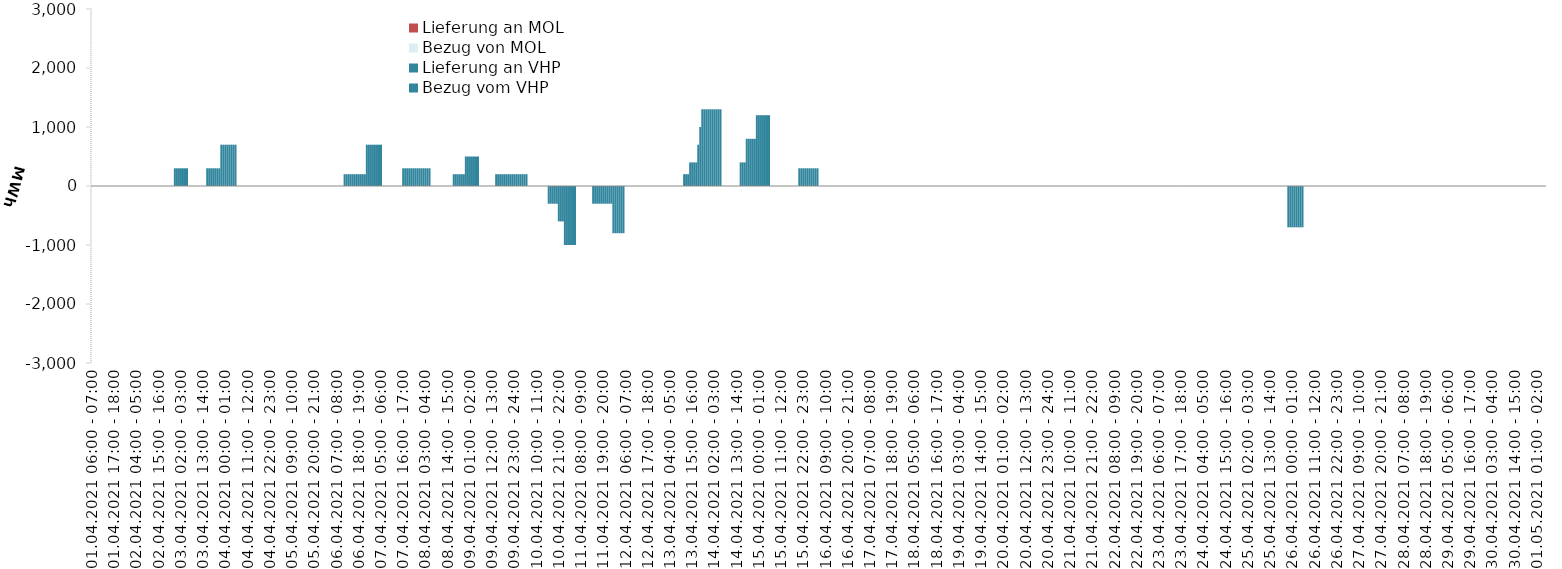
| Category | Bezug vom VHP | Lieferung an VHP | Bezug von MOL | Lieferung an MOL |
|---|---|---|---|---|
| 01.04.2021 06:00 - 07:00 | 0 | 0 | 0 | 0 |
| 01.04.2021 07:00 - 08:00 | 0 | 0 | 0 | 0 |
| 01.04.2021 08:00 - 09:00 | 0 | 0 | 0 | 0 |
| 01.04.2021 09:00 - 10:00 | 0 | 0 | 0 | 0 |
| 01.04.2021 10:00 - 11:00 | 0 | 0 | 0 | 0 |
| 01.04.2021 11:00 - 12:00 | 0 | 0 | 0 | 0 |
| 01.04.2021 12:00 - 13:00 | 0 | 0 | 0 | 0 |
| 01.04.2021 13:00 - 14:00 | 0 | 0 | 0 | 0 |
| 01.04.2021 14:00 - 15:00 | 0 | 0 | 0 | 0 |
| 01.04.2021 15:00 - 16:00 | 0 | 0 | 0 | 0 |
| 01.04.2021 16:00 - 17:00 | 0 | 0 | 0 | 0 |
| 01.04.2021 17:00 - 18:00 | 0 | 0 | 0 | 0 |
| 01.04.2021 18:00 - 19:00 | 0 | 0 | 0 | 0 |
| 01.04.2021 19:00 - 20:00 | 0 | 0 | 0 | 0 |
| 01.04.2021 20:00 - 21:00 | 0 | 0 | 0 | 0 |
| 01.04.2021 21:00 - 22:00 | 0 | 0 | 0 | 0 |
| 01.04.2021 22:00 - 23:00 | 0 | 0 | 0 | 0 |
| 01.04.2021 23:00 - 24:00 | 0 | 0 | 0 | 0 |
| 02.04.2021 00:00 - 01:00 | 0 | 0 | 0 | 0 |
| 02.04.2021 01:00 - 02:00 | 0 | 0 | 0 | 0 |
| 02.04.2021 02:00 - 03:00 | 0 | 0 | 0 | 0 |
| 02.04.2021 03:00 - 04:00 | 0 | 0 | 0 | 0 |
| 02.04.2021 04:00 - 05:00 | 0 | 0 | 0 | 0 |
| 02.04.2021 05:00 - 06:00 | 0 | 0 | 0 | 0 |
| 02.04.2021 06:00 - 07:00 | 0 | 0 | 0 | 0 |
| 02.04.2021 07:00 - 08:00 | 0 | 0 | 0 | 0 |
| 02.04.2021 08:00 - 09:00 | 0 | 0 | 0 | 0 |
| 02.04.2021 09:00 - 10:00 | 0 | 0 | 0 | 0 |
| 02.04.2021 10:00 - 11:00 | 0 | 0 | 0 | 0 |
| 02.04.2021 11:00 - 12:00 | 0 | 0 | 0 | 0 |
| 02.04.2021 12:00 - 13:00 | 0 | 0 | 0 | 0 |
| 02.04.2021 13:00 - 14:00 | 0 | 0 | 0 | 0 |
| 02.04.2021 14:00 - 15:00 | 0 | 0 | 0 | 0 |
| 02.04.2021 15:00 - 16:00 | 0 | 0 | 0 | 0 |
| 02.04.2021 16:00 - 17:00 | 0 | 0 | 0 | 0 |
| 02.04.2021 17:00 - 18:00 | 0 | 0 | 0 | 0 |
| 02.04.2021 18:00 - 19:00 | 0 | 0 | 0 | 0 |
| 02.04.2021 19:00 - 20:00 | 0 | 0 | 0 | 0 |
| 02.04.2021 20:00 - 21:00 | 0 | 0 | 0 | 0 |
| 02.04.2021 21:00 - 22:00 | 0 | 0 | 0 | 0 |
| 02.04.2021 22:00 - 23:00 | 0 | 0 | 0 | 0 |
| 02.04.2021 23:00 - 24:00 | 300 | 0 | 0 | 0 |
| 03.04.2021 00:00 - 01:00 | 300 | 0 | 0 | 0 |
| 03.04.2021 01:00 - 02:00 | 300 | 0 | 0 | 0 |
| 03.04.2021 02:00 - 03:00 | 300 | 0 | 0 | 0 |
| 03.04.2021 03:00 - 04:00 | 300 | 0 | 0 | 0 |
| 03.04.2021 04:00 - 05:00 | 300 | 0 | 0 | 0 |
| 03.04.2021 05:00 - 06:00 | 300 | 0 | 0 | 0 |
| 03.04.2021 06:00 - 07:00 | 0 | 0 | 0 | 0 |
| 03.04.2021 07:00 - 08:00 | 0 | 0 | 0 | 0 |
| 03.04.2021 08:00 - 09:00 | 0 | 0 | 0 | 0 |
| 03.04.2021 09:00 - 10:00 | 0 | 0 | 0 | 0 |
| 03.04.2021 10:00 - 11:00 | 0 | 0 | 0 | 0 |
| 03.04.2021 11:00 - 12:00 | 0 | 0 | 0 | 0 |
| 03.04.2021 12:00 - 13:00 | 0 | 0 | 0 | 0 |
| 03.04.2021 13:00 - 14:00 | 0 | 0 | 0 | 0 |
| 03.04.2021 14:00 - 15:00 | 0 | 0 | 0 | 0 |
| 03.04.2021 15:00 - 16:00 | 300 | 0 | 0 | 0 |
| 03.04.2021 16:00 - 17:00 | 300 | 0 | 0 | 0 |
| 03.04.2021 17:00 - 18:00 | 300 | 0 | 0 | 0 |
| 03.04.2021 18:00 - 19:00 | 300 | 0 | 0 | 0 |
| 03.04.2021 19:00 - 20:00 | 300 | 0 | 0 | 0 |
| 03.04.2021 20:00 - 21:00 | 300 | 0 | 0 | 0 |
| 03.04.2021 21:00 - 22:00 | 300 | 0 | 0 | 0 |
| 03.04.2021 22:00 - 23:00 | 700 | 0 | 0 | 0 |
| 03.04.2021 23:00 - 24:00 | 700 | 0 | 0 | 0 |
| 04.04.2021 00:00 - 01:00 | 700 | 0 | 0 | 0 |
| 04.04.2021 01:00 - 02:00 | 700 | 0 | 0 | 0 |
| 04.04.2021 02:00 - 03:00 | 700 | 0 | 0 | 0 |
| 04.04.2021 03:00 - 04:00 | 700 | 0 | 0 | 0 |
| 04.04.2021 04:00 - 05:00 | 700 | 0 | 0 | 0 |
| 04.04.2021 05:00 - 06:00 | 700 | 0 | 0 | 0 |
| 04.04.2021 06:00 - 07:00 | 0 | 0 | 0 | 0 |
| 04.04.2021 07:00 - 08:00 | 0 | 0 | 0 | 0 |
| 04.04.2021 08:00 - 09:00 | 0 | 0 | 0 | 0 |
| 04.04.2021 09:00 - 10:00 | 0 | 0 | 0 | 0 |
| 04.04.2021 10:00 - 11:00 | 0 | 0 | 0 | 0 |
| 04.04.2021 11:00 - 12:00 | 0 | 0 | 0 | 0 |
| 04.04.2021 12:00 - 13:00 | 0 | 0 | 0 | 0 |
| 04.04.2021 13:00 - 14:00 | 0 | 0 | 0 | 0 |
| 04.04.2021 14:00 - 15:00 | 0 | 0 | 0 | 0 |
| 04.04.2021 15:00 - 16:00 | 0 | 0 | 0 | 0 |
| 04.04.2021 16:00 - 17:00 | 0 | 0 | 0 | 0 |
| 04.04.2021 17:00 - 18:00 | 0 | 0 | 0 | 0 |
| 04.04.2021 18:00 - 19:00 | 0 | 0 | 0 | 0 |
| 04.04.2021 19:00 - 20:00 | 0 | 0 | 0 | 0 |
| 04.04.2021 20:00 - 21:00 | 0 | 0 | 0 | 0 |
| 04.04.2021 21:00 - 22:00 | 0 | 0 | 0 | 0 |
| 04.04.2021 22:00 - 23:00 | 0 | 0 | 0 | 0 |
| 04.04.2021 23:00 - 24:00 | 0 | 0 | 0 | 0 |
| 05.04.2021 00:00 - 01:00 | 0 | 0 | 0 | 0 |
| 05.04.2021 01:00 - 02:00 | 0 | 0 | 0 | 0 |
| 05.04.2021 02:00 - 03:00 | 0 | 0 | 0 | 0 |
| 05.04.2021 03:00 - 04:00 | 0 | 0 | 0 | 0 |
| 05.04.2021 04:00 - 05:00 | 0 | 0 | 0 | 0 |
| 05.04.2021 05:00 - 06:00 | 0 | 0 | 0 | 0 |
| 05.04.2021 06:00 - 07:00 | 0 | 0 | 0 | 0 |
| 05.04.2021 07:00 - 08:00 | 0 | 0 | 0 | 0 |
| 05.04.2021 08:00 - 09:00 | 0 | 0 | 0 | 0 |
| 05.04.2021 09:00 - 10:00 | 0 | 0 | 0 | 0 |
| 05.04.2021 10:00 - 11:00 | 0 | 0 | 0 | 0 |
| 05.04.2021 11:00 - 12:00 | 0 | 0 | 0 | 0 |
| 05.04.2021 12:00 - 13:00 | 0 | 0 | 0 | 0 |
| 05.04.2021 13:00 - 14:00 | 0 | 0 | 0 | 0 |
| 05.04.2021 14:00 - 15:00 | 0 | 0 | 0 | 0 |
| 05.04.2021 15:00 - 16:00 | 0 | 0 | 0 | 0 |
| 05.04.2021 16:00 - 17:00 | 0 | 0 | 0 | 0 |
| 05.04.2021 17:00 - 18:00 | 0 | 0 | 0 | 0 |
| 05.04.2021 18:00 - 19:00 | 0 | 0 | 0 | 0 |
| 05.04.2021 19:00 - 20:00 | 0 | 0 | 0 | 0 |
| 05.04.2021 20:00 - 21:00 | 0 | 0 | 0 | 0 |
| 05.04.2021 21:00 - 22:00 | 0 | 0 | 0 | 0 |
| 05.04.2021 22:00 - 23:00 | 0 | 0 | 0 | 0 |
| 05.04.2021 23:00 - 24:00 | 0 | 0 | 0 | 0 |
| 06.04.2021 00:00 - 01:00 | 0 | 0 | 0 | 0 |
| 06.04.2021 01:00 - 02:00 | 0 | 0 | 0 | 0 |
| 06.04.2021 02:00 - 03:00 | 0 | 0 | 0 | 0 |
| 06.04.2021 03:00 - 04:00 | 0 | 0 | 0 | 0 |
| 06.04.2021 04:00 - 05:00 | 0 | 0 | 0 | 0 |
| 06.04.2021 05:00 - 06:00 | 0 | 0 | 0 | 0 |
| 06.04.2021 06:00 - 07:00 | 0 | 0 | 0 | 0 |
| 06.04.2021 07:00 - 08:00 | 0 | 0 | 0 | 0 |
| 06.04.2021 08:00 - 09:00 | 0 | 0 | 0 | 0 |
| 06.04.2021 09:00 - 10:00 | 0 | 0 | 0 | 0 |
| 06.04.2021 10:00 - 11:00 | 0 | 0 | 0 | 0 |
| 06.04.2021 11:00 - 12:00 | 200 | 0 | 0 | 0 |
| 06.04.2021 12:00 - 13:00 | 200 | 0 | 0 | 0 |
| 06.04.2021 13:00 - 14:00 | 200 | 0 | 0 | 0 |
| 06.04.2021 14:00 - 15:00 | 200 | 0 | 0 | 0 |
| 06.04.2021 15:00 - 16:00 | 200 | 0 | 0 | 0 |
| 06.04.2021 16:00 - 17:00 | 200 | 0 | 0 | 0 |
| 06.04.2021 17:00 - 18:00 | 200 | 0 | 0 | 0 |
| 06.04.2021 18:00 - 19:00 | 200 | 0 | 0 | 0 |
| 06.04.2021 19:00 - 20:00 | 200 | 0 | 0 | 0 |
| 06.04.2021 20:00 - 21:00 | 200 | 0 | 0 | 0 |
| 06.04.2021 21:00 - 22:00 | 200 | 0 | 0 | 0 |
| 06.04.2021 22:00 - 23:00 | 700 | 0 | 0 | 0 |
| 06.04.2021 23:00 - 24:00 | 700 | 0 | 0 | 0 |
| 07.04.2021 00:00 - 01:00 | 700 | 0 | 0 | 0 |
| 07.04.2021 01:00 - 02:00 | 700 | 0 | 0 | 0 |
| 07.04.2021 02:00 - 03:00 | 700 | 0 | 0 | 0 |
| 07.04.2021 03:00 - 04:00 | 700 | 0 | 0 | 0 |
| 07.04.2021 04:00 - 05:00 | 700 | 0 | 0 | 0 |
| 07.04.2021 05:00 - 06:00 | 700 | 0 | 0 | 0 |
| 07.04.2021 06:00 - 07:00 | 0 | 0 | 0 | 0 |
| 07.04.2021 07:00 - 08:00 | 0 | 0 | 0 | 0 |
| 07.04.2021 08:00 - 09:00 | 0 | 0 | 0 | 0 |
| 07.04.2021 09:00 - 10:00 | 0 | 0 | 0 | 0 |
| 07.04.2021 10:00 - 11:00 | 0 | 0 | 0 | 0 |
| 07.04.2021 11:00 - 12:00 | 0 | 0 | 0 | 0 |
| 07.04.2021 12:00 - 13:00 | 0 | 0 | 0 | 0 |
| 07.04.2021 13:00 - 14:00 | 0 | 0 | 0 | 0 |
| 07.04.2021 14:00 - 15:00 | 0 | 0 | 0 | 0 |
| 07.04.2021 15:00 - 16:00 | 0 | 0 | 0 | 0 |
| 07.04.2021 16:00 - 17:00 | 300 | 0 | 0 | 0 |
| 07.04.2021 17:00 - 18:00 | 300 | 0 | 0 | 0 |
| 07.04.2021 18:00 - 19:00 | 300 | 0 | 0 | 0 |
| 07.04.2021 19:00 - 20:00 | 300 | 0 | 0 | 0 |
| 07.04.2021 20:00 - 21:00 | 300 | 0 | 0 | 0 |
| 07.04.2021 21:00 - 22:00 | 300 | 0 | 0 | 0 |
| 07.04.2021 22:00 - 23:00 | 300 | 0 | 0 | 0 |
| 07.04.2021 23:00 - 24:00 | 300 | 0 | 0 | 0 |
| 08.04.2021 00:00 - 01:00 | 300 | 0 | 0 | 0 |
| 08.04.2021 01:00 - 02:00 | 300 | 0 | 0 | 0 |
| 08.04.2021 02:00 - 03:00 | 300 | 0 | 0 | 0 |
| 08.04.2021 03:00 - 04:00 | 300 | 0 | 0 | 0 |
| 08.04.2021 04:00 - 05:00 | 300 | 0 | 0 | 0 |
| 08.04.2021 05:00 - 06:00 | 300 | 0 | 0 | 0 |
| 08.04.2021 06:00 - 07:00 | 0 | 0 | 0 | 0 |
| 08.04.2021 07:00 - 08:00 | 0 | 0 | 0 | 0 |
| 08.04.2021 08:00 - 09:00 | 0 | 0 | 0 | 0 |
| 08.04.2021 09:00 - 10:00 | 0 | 0 | 0 | 0 |
| 08.04.2021 10:00 - 11:00 | 0 | 0 | 0 | 0 |
| 08.04.2021 11:00 - 12:00 | 0 | 0 | 0 | 0 |
| 08.04.2021 12:00 - 13:00 | 0 | 0 | 0 | 0 |
| 08.04.2021 13:00 - 14:00 | 0 | 0 | 0 | 0 |
| 08.04.2021 14:00 - 15:00 | 0 | 0 | 0 | 0 |
| 08.04.2021 15:00 - 16:00 | 0 | 0 | 0 | 0 |
| 08.04.2021 16:00 - 17:00 | 0 | 0 | 0 | 0 |
| 08.04.2021 17:00 - 18:00 | 200 | 0 | 0 | 0 |
| 08.04.2021 18:00 - 19:00 | 200 | 0 | 0 | 0 |
| 08.04.2021 19:00 - 20:00 | 200 | 0 | 0 | 0 |
| 08.04.2021 20:00 - 21:00 | 200 | 0 | 0 | 0 |
| 08.04.2021 21:00 - 22:00 | 200 | 0 | 0 | 0 |
| 08.04.2021 22:00 - 23:00 | 200 | 0 | 0 | 0 |
| 08.04.2021 23:00 - 24:00 | 500 | 0 | 0 | 0 |
| 09.04.2021 00:00 - 01:00 | 500 | 0 | 0 | 0 |
| 09.04.2021 01:00 - 02:00 | 500 | 0 | 0 | 0 |
| 09.04.2021 02:00 - 03:00 | 500 | 0 | 0 | 0 |
| 09.04.2021 03:00 - 04:00 | 500 | 0 | 0 | 0 |
| 09.04.2021 04:00 - 05:00 | 500 | 0 | 0 | 0 |
| 09.04.2021 05:00 - 06:00 | 500 | 0 | 0 | 0 |
| 09.04.2021 06:00 - 07:00 | 0 | 0 | 0 | 0 |
| 09.04.2021 07:00 - 08:00 | 0 | 0 | 0 | 0 |
| 09.04.2021 08:00 - 09:00 | 0 | 0 | 0 | 0 |
| 09.04.2021 09:00 - 10:00 | 0 | 0 | 0 | 0 |
| 09.04.2021 10:00 - 11:00 | 0 | 0 | 0 | 0 |
| 09.04.2021 11:00 - 12:00 | 0 | 0 | 0 | 0 |
| 09.04.2021 12:00 - 13:00 | 0 | 0 | 0 | 0 |
| 09.04.2021 13:00 - 14:00 | 0 | 0 | 0 | 0 |
| 09.04.2021 14:00 - 15:00 | 200 | 0 | 0 | 0 |
| 09.04.2021 15:00 - 16:00 | 200 | 0 | 0 | 0 |
| 09.04.2021 16:00 - 17:00 | 200 | 0 | 0 | 0 |
| 09.04.2021 17:00 - 18:00 | 200 | 0 | 0 | 0 |
| 09.04.2021 18:00 - 19:00 | 200 | 0 | 0 | 0 |
| 09.04.2021 19:00 - 20:00 | 200 | 0 | 0 | 0 |
| 09.04.2021 20:00 - 21:00 | 200 | 0 | 0 | 0 |
| 09.04.2021 21:00 - 22:00 | 200 | 0 | 0 | 0 |
| 09.04.2021 22:00 - 23:00 | 200 | 0 | 0 | 0 |
| 09.04.2021 23:00 - 24:00 | 200 | 0 | 0 | 0 |
| 10.04.2021 00:00 - 01:00 | 200 | 0 | 0 | 0 |
| 10.04.2021 01:00 - 02:00 | 200 | 0 | 0 | 0 |
| 10.04.2021 02:00 - 03:00 | 200 | 0 | 0 | 0 |
| 10.04.2021 03:00 - 04:00 | 200 | 0 | 0 | 0 |
| 10.04.2021 04:00 - 05:00 | 200 | 0 | 0 | 0 |
| 10.04.2021 05:00 - 06:00 | 200 | 0 | 0 | 0 |
| 10.04.2021 06:00 - 07:00 | 0 | 0 | 0 | 0 |
| 10.04.2021 07:00 - 08:00 | 0 | 0 | 0 | 0 |
| 10.04.2021 08:00 - 09:00 | 0 | 0 | 0 | 0 |
| 10.04.2021 09:00 - 10:00 | 0 | 0 | 0 | 0 |
| 10.04.2021 10:00 - 11:00 | 0 | 0 | 0 | 0 |
| 10.04.2021 11:00 - 12:00 | 0 | 0 | 0 | 0 |
| 10.04.2021 12:00 - 13:00 | 0 | 0 | 0 | 0 |
| 10.04.2021 13:00 - 14:00 | 0 | 0 | 0 | 0 |
| 10.04.2021 14:00 - 15:00 | 0 | 0 | 0 | 0 |
| 10.04.2021 15:00 - 16:00 | 0 | 0 | 0 | 0 |
| 10.04.2021 16:00 - 17:00 | 0 | -300 | 0 | 0 |
| 10.04.2021 17:00 - 18:00 | 0 | -300 | 0 | 0 |
| 10.04.2021 18:00 - 19:00 | 0 | -300 | 0 | 0 |
| 10.04.2021 19:00 - 20:00 | 0 | -300 | 0 | 0 |
| 10.04.2021 20:00 - 21:00 | 0 | -300 | 0 | 0 |
| 10.04.2021 21:00 - 22:00 | 0 | -600 | 0 | 0 |
| 10.04.2021 22:00 - 23:00 | 0 | -600 | 0 | 0 |
| 10.04.2021 23:00 - 24:00 | 0 | -600 | 0 | 0 |
| 11.04.2021 00:00 - 01:00 | 0 | -1000 | 0 | 0 |
| 11.04.2021 01:00 - 02:00 | 0 | -1000 | 0 | 0 |
| 11.04.2021 02:00 - 03:00 | 0 | -1000 | 0 | 0 |
| 11.04.2021 03:00 - 04:00 | 0 | -1000 | 0 | 0 |
| 11.04.2021 04:00 - 05:00 | 0 | -1000 | 0 | 0 |
| 11.04.2021 05:00 - 06:00 | 0 | -1000 | 0 | 0 |
| 11.04.2021 06:00 - 07:00 | 0 | 0 | 0 | 0 |
| 11.04.2021 07:00 - 08:00 | 0 | 0 | 0 | 0 |
| 11.04.2021 08:00 - 09:00 | 0 | 0 | 0 | 0 |
| 11.04.2021 09:00 - 10:00 | 0 | 0 | 0 | 0 |
| 11.04.2021 10:00 - 11:00 | 0 | 0 | 0 | 0 |
| 11.04.2021 11:00 - 12:00 | 0 | 0 | 0 | 0 |
| 11.04.2021 12:00 - 13:00 | 0 | 0 | 0 | 0 |
| 11.04.2021 13:00 - 14:00 | 0 | 0 | 0 | 0 |
| 11.04.2021 14:00 - 15:00 | 0 | -300 | 0 | 0 |
| 11.04.2021 15:00 - 16:00 | 0 | -300 | 0 | 0 |
| 11.04.2021 16:00 - 17:00 | 0 | -300 | 0 | 0 |
| 11.04.2021 17:00 - 18:00 | 0 | -300 | 0 | 0 |
| 11.04.2021 18:00 - 19:00 | 0 | -300 | 0 | 0 |
| 11.04.2021 19:00 - 20:00 | 0 | -300 | 0 | 0 |
| 11.04.2021 20:00 - 21:00 | 0 | -300 | 0 | 0 |
| 11.04.2021 21:00 - 22:00 | 0 | -300 | 0 | 0 |
| 11.04.2021 22:00 - 23:00 | 0 | -300 | 0 | 0 |
| 11.04.2021 23:00 - 24:00 | 0 | -300 | 0 | 0 |
| 12.04.2021 00:00 - 01:00 | 0 | -800 | 0 | 0 |
| 12.04.2021 01:00 - 02:00 | 0 | -800 | 0 | 0 |
| 12.04.2021 02:00 - 03:00 | 0 | -800 | 0 | 0 |
| 12.04.2021 03:00 - 04:00 | 0 | -800 | 0 | 0 |
| 12.04.2021 04:00 - 05:00 | 0 | -800 | 0 | 0 |
| 12.04.2021 05:00 - 06:00 | 0 | -800 | 0 | 0 |
| 12.04.2021 06:00 - 07:00 | 0 | 0 | 0 | 0 |
| 12.04.2021 07:00 - 08:00 | 0 | 0 | 0 | 0 |
| 12.04.2021 08:00 - 09:00 | 0 | 0 | 0 | 0 |
| 12.04.2021 09:00 - 10:00 | 0 | 0 | 0 | 0 |
| 12.04.2021 10:00 - 11:00 | 0 | 0 | 0 | 0 |
| 12.04.2021 11:00 - 12:00 | 0 | 0 | 0 | 0 |
| 12.04.2021 12:00 - 13:00 | 0 | 0 | 0 | 0 |
| 12.04.2021 13:00 - 14:00 | 0 | 0 | 0 | 0 |
| 12.04.2021 14:00 - 15:00 | 0 | 0 | 0 | 0 |
| 12.04.2021 15:00 - 16:00 | 0 | 0 | 0 | 0 |
| 12.04.2021 16:00 - 17:00 | 0 | 0 | 0 | 0 |
| 12.04.2021 17:00 - 18:00 | 0 | 0 | 0 | 0 |
| 12.04.2021 18:00 - 19:00 | 0 | 0 | 0 | 0 |
| 12.04.2021 19:00 - 20:00 | 0 | 0 | 0 | 0 |
| 12.04.2021 20:00 - 21:00 | 0 | 0 | 0 | 0 |
| 12.04.2021 21:00 - 22:00 | 0 | 0 | 0 | 0 |
| 12.04.2021 22:00 - 23:00 | 0 | 0 | 0 | 0 |
| 12.04.2021 23:00 - 24:00 | 0 | 0 | 0 | 0 |
| 13.04.2021 00:00 - 01:00 | 0 | 0 | 0 | 0 |
| 13.04.2021 01:00 - 02:00 | 0 | 0 | 0 | 0 |
| 13.04.2021 02:00 - 03:00 | 0 | 0 | 0 | 0 |
| 13.04.2021 03:00 - 04:00 | 0 | 0 | 0 | 0 |
| 13.04.2021 04:00 - 05:00 | 0 | 0 | 0 | 0 |
| 13.04.2021 05:00 - 06:00 | 0 | 0 | 0 | 0 |
| 13.04.2021 06:00 - 07:00 | 0 | 0 | 0 | 0 |
| 13.04.2021 07:00 - 08:00 | 0 | 0 | 0 | 0 |
| 13.04.2021 08:00 - 09:00 | 0 | 0 | 0 | 0 |
| 13.04.2021 09:00 - 10:00 | 0 | 0 | 0 | 0 |
| 13.04.2021 10:00 - 11:00 | 0 | 0 | 0 | 0 |
| 13.04.2021 11:00 - 12:00 | 200 | 0 | 0 | 0 |
| 13.04.2021 12:00 - 13:00 | 200 | 0 | 0 | 0 |
| 13.04.2021 13:00 - 14:00 | 200 | 0 | 0 | 0 |
| 13.04.2021 14:00 - 15:00 | 400 | 0 | 0 | 0 |
| 13.04.2021 15:00 - 16:00 | 400 | 0 | 0 | 0 |
| 13.04.2021 16:00 - 17:00 | 400 | 0 | 0 | 0 |
| 13.04.2021 17:00 - 18:00 | 400 | 0 | 0 | 0 |
| 13.04.2021 18:00 - 19:00 | 700 | 0 | 0 | 0 |
| 13.04.2021 19:00 - 20:00 | 1000 | 0 | 0 | 0 |
| 13.04.2021 20:00 - 21:00 | 1300 | 0 | 0 | 0 |
| 13.04.2021 21:00 - 22:00 | 1300 | 0 | 0 | 0 |
| 13.04.2021 22:00 - 23:00 | 1300 | 0 | 0 | 0 |
| 13.04.2021 23:00 - 24:00 | 1300 | 0 | 0 | 0 |
| 14.04.2021 00:00 - 01:00 | 1300 | 0 | 0 | 0 |
| 14.04.2021 01:00 - 02:00 | 1300 | 0 | 0 | 0 |
| 14.04.2021 02:00 - 03:00 | 1300 | 0 | 0 | 0 |
| 14.04.2021 03:00 - 04:00 | 1300 | 0 | 0 | 0 |
| 14.04.2021 04:00 - 05:00 | 1300 | 0 | 0 | 0 |
| 14.04.2021 05:00 - 06:00 | 1300 | 0 | 0 | 0 |
| 14.04.2021 06:00 - 07:00 | 0 | 0 | 0 | 0 |
| 14.04.2021 07:00 - 08:00 | 0 | 0 | 0 | 0 |
| 14.04.2021 08:00 - 09:00 | 0 | 0 | 0 | 0 |
| 14.04.2021 09:00 - 10:00 | 0 | 0 | 0 | 0 |
| 14.04.2021 10:00 - 11:00 | 0 | 0 | 0 | 0 |
| 14.04.2021 11:00 - 12:00 | 0 | 0 | 0 | 0 |
| 14.04.2021 12:00 - 13:00 | 0 | 0 | 0 | 0 |
| 14.04.2021 13:00 - 14:00 | 0 | 0 | 0 | 0 |
| 14.04.2021 14:00 - 15:00 | 0 | 0 | 0 | 0 |
| 14.04.2021 15:00 - 16:00 | 400 | 0 | 0 | 0 |
| 14.04.2021 16:00 - 17:00 | 400 | 0 | 0 | 0 |
| 14.04.2021 17:00 - 18:00 | 400 | 0 | 0 | 0 |
| 14.04.2021 18:00 - 19:00 | 800 | 0 | 0 | 0 |
| 14.04.2021 19:00 - 20:00 | 800 | 0 | 0 | 0 |
| 14.04.2021 20:00 - 21:00 | 800 | 0 | 0 | 0 |
| 14.04.2021 21:00 - 22:00 | 800 | 0 | 0 | 0 |
| 14.04.2021 22:00 - 23:00 | 800 | 0 | 0 | 0 |
| 14.04.2021 23:00 - 24:00 | 1200 | 0 | 0 | 0 |
| 15.04.2021 00:00 - 01:00 | 1200 | 0 | 0 | 0 |
| 15.04.2021 01:00 - 02:00 | 1200 | 0 | 0 | 0 |
| 15.04.2021 02:00 - 03:00 | 1200 | 0 | 0 | 0 |
| 15.04.2021 03:00 - 04:00 | 1200 | 0 | 0 | 0 |
| 15.04.2021 04:00 - 05:00 | 1200 | 0 | 0 | 0 |
| 15.04.2021 05:00 - 06:00 | 1200 | 0 | 0 | 0 |
| 15.04.2021 06:00 - 07:00 | 0 | 0 | 0 | 0 |
| 15.04.2021 07:00 - 08:00 | 0 | 0 | 0 | 0 |
| 15.04.2021 08:00 - 09:00 | 0 | 0 | 0 | 0 |
| 15.04.2021 09:00 - 10:00 | 0 | 0 | 0 | 0 |
| 15.04.2021 10:00 - 11:00 | 0 | 0 | 0 | 0 |
| 15.04.2021 11:00 - 12:00 | 0 | 0 | 0 | 0 |
| 15.04.2021 12:00 - 13:00 | 0 | 0 | 0 | 0 |
| 15.04.2021 13:00 - 14:00 | 0 | 0 | 0 | 0 |
| 15.04.2021 14:00 - 15:00 | 0 | 0 | 0 | 0 |
| 15.04.2021 15:00 - 16:00 | 0 | 0 | 0 | 0 |
| 15.04.2021 16:00 - 17:00 | 0 | 0 | 0 | 0 |
| 15.04.2021 17:00 - 18:00 | 0 | 0 | 0 | 0 |
| 15.04.2021 18:00 - 19:00 | 0 | 0 | 0 | 0 |
| 15.04.2021 19:00 - 20:00 | 0 | 0 | 0 | 0 |
| 15.04.2021 20:00 - 21:00 | 300 | 0 | 0 | 0 |
| 15.04.2021 21:00 - 22:00 | 300 | 0 | 0 | 0 |
| 15.04.2021 22:00 - 23:00 | 300 | 0 | 0 | 0 |
| 15.04.2021 23:00 - 24:00 | 300 | 0 | 0 | 0 |
| 16.04.2021 00:00 - 01:00 | 300 | 0 | 0 | 0 |
| 16.04.2021 01:00 - 02:00 | 300 | 0 | 0 | 0 |
| 16.04.2021 02:00 - 03:00 | 300 | 0 | 0 | 0 |
| 16.04.2021 03:00 - 04:00 | 300 | 0 | 0 | 0 |
| 16.04.2021 04:00 - 05:00 | 300 | 0 | 0 | 0 |
| 16.04.2021 05:00 - 06:00 | 300 | 0 | 0 | 0 |
| 16.04.2021 06:00 - 07:00 | 0 | 0 | 0 | 0 |
| 16.04.2021 07:00 - 08:00 | 0 | 0 | 0 | 0 |
| 16.04.2021 08:00 - 09:00 | 0 | 0 | 0 | 0 |
| 16.04.2021 09:00 - 10:00 | 0 | 0 | 0 | 0 |
| 16.04.2021 10:00 - 11:00 | 0 | 0 | 0 | 0 |
| 16.04.2021 11:00 - 12:00 | 0 | 0 | 0 | 0 |
| 16.04.2021 12:00 - 13:00 | 0 | 0 | 0 | 0 |
| 16.04.2021 13:00 - 14:00 | 0 | 0 | 0 | 0 |
| 16.04.2021 14:00 - 15:00 | 0 | 0 | 0 | 0 |
| 16.04.2021 15:00 - 16:00 | 0 | 0 | 0 | 0 |
| 16.04.2021 16:00 - 17:00 | 0 | 0 | 0 | 0 |
| 16.04.2021 17:00 - 18:00 | 0 | 0 | 0 | 0 |
| 16.04.2021 18:00 - 19:00 | 0 | 0 | 0 | 0 |
| 16.04.2021 19:00 - 20:00 | 0 | 0 | 0 | 0 |
| 16.04.2021 20:00 - 21:00 | 0 | 0 | 0 | 0 |
| 16.04.2021 21:00 - 22:00 | 0 | 0 | 0 | 0 |
| 16.04.2021 22:00 - 23:00 | 0 | 0 | 0 | 0 |
| 16.04.2021 23:00 - 24:00 | 0 | 0 | 0 | 0 |
| 17.04.2021 00:00 - 01:00 | 0 | 0 | 0 | 0 |
| 17.04.2021 01:00 - 02:00 | 0 | 0 | 0 | 0 |
| 17.04.2021 02:00 - 03:00 | 0 | 0 | 0 | 0 |
| 17.04.2021 03:00 - 04:00 | 0 | 0 | 0 | 0 |
| 17.04.2021 04:00 - 05:00 | 0 | 0 | 0 | 0 |
| 17.04.2021 05:00 - 06:00 | 0 | 0 | 0 | 0 |
| 17.04.2021 06:00 - 07:00 | 0 | 0 | 0 | 0 |
| 17.04.2021 07:00 - 08:00 | 0 | 0 | 0 | 0 |
| 17.04.2021 08:00 - 09:00 | 0 | 0 | 0 | 0 |
| 17.04.2021 09:00 - 10:00 | 0 | 0 | 0 | 0 |
| 17.04.2021 10:00 - 11:00 | 0 | 0 | 0 | 0 |
| 17.04.2021 11:00 - 12:00 | 0 | 0 | 0 | 0 |
| 17.04.2021 12:00 - 13:00 | 0 | 0 | 0 | 0 |
| 17.04.2021 13:00 - 14:00 | 0 | 0 | 0 | 0 |
| 17.04.2021 14:00 - 15:00 | 0 | 0 | 0 | 0 |
| 17.04.2021 15:00 - 16:00 | 0 | 0 | 0 | 0 |
| 17.04.2021 16:00 - 17:00 | 0 | 0 | 0 | 0 |
| 17.04.2021 17:00 - 18:00 | 0 | 0 | 0 | 0 |
| 17.04.2021 18:00 - 19:00 | 0 | 0 | 0 | 0 |
| 17.04.2021 19:00 - 20:00 | 0 | 0 | 0 | 0 |
| 17.04.2021 20:00 - 21:00 | 0 | 0 | 0 | 0 |
| 17.04.2021 21:00 - 22:00 | 0 | 0 | 0 | 0 |
| 17.04.2021 22:00 - 23:00 | 0 | 0 | 0 | 0 |
| 17.04.2021 23:00 - 24:00 | 0 | 0 | 0 | 0 |
| 18.04.2021 00:00 - 01:00 | 0 | 0 | 0 | 0 |
| 18.04.2021 01:00 - 02:00 | 0 | 0 | 0 | 0 |
| 18.04.2021 02:00 - 03:00 | 0 | 0 | 0 | 0 |
| 18.04.2021 03:00 - 04:00 | 0 | 0 | 0 | 0 |
| 18.04.2021 04:00 - 05:00 | 0 | 0 | 0 | 0 |
| 18.04.2021 05:00 - 06:00 | 0 | 0 | 0 | 0 |
| 18.04.2021 06:00 - 07:00 | 0 | 0 | 0 | 0 |
| 18.04.2021 07:00 - 08:00 | 0 | 0 | 0 | 0 |
| 18.04.2021 08:00 - 09:00 | 0 | 0 | 0 | 0 |
| 18.04.2021 09:00 - 10:00 | 0 | 0 | 0 | 0 |
| 18.04.2021 10:00 - 11:00 | 0 | 0 | 0 | 0 |
| 18.04.2021 11:00 - 12:00 | 0 | 0 | 0 | 0 |
| 18.04.2021 12:00 - 13:00 | 0 | 0 | 0 | 0 |
| 18.04.2021 13:00 - 14:00 | 0 | 0 | 0 | 0 |
| 18.04.2021 14:00 - 15:00 | 0 | 0 | 0 | 0 |
| 18.04.2021 15:00 - 16:00 | 0 | 0 | 0 | 0 |
| 18.04.2021 16:00 - 17:00 | 0 | 0 | 0 | 0 |
| 18.04.2021 17:00 - 18:00 | 0 | 0 | 0 | 0 |
| 18.04.2021 18:00 - 19:00 | 0 | 0 | 0 | 0 |
| 18.04.2021 19:00 - 20:00 | 0 | 0 | 0 | 0 |
| 18.04.2021 20:00 - 21:00 | 0 | 0 | 0 | 0 |
| 18.04.2021 21:00 - 22:00 | 0 | 0 | 0 | 0 |
| 18.04.2021 22:00 - 23:00 | 0 | 0 | 0 | 0 |
| 18.04.2021 23:00 - 24:00 | 0 | 0 | 0 | 0 |
| 19.04.2021 00:00 - 01:00 | 0 | 0 | 0 | 0 |
| 19.04.2021 01:00 - 02:00 | 0 | 0 | 0 | 0 |
| 19.04.2021 02:00 - 03:00 | 0 | 0 | 0 | 0 |
| 19.04.2021 03:00 - 04:00 | 0 | 0 | 0 | 0 |
| 19.04.2021 04:00 - 05:00 | 0 | 0 | 0 | 0 |
| 19.04.2021 05:00 - 06:00 | 0 | 0 | 0 | 0 |
| 19.04.2021 06:00 - 07:00 | 0 | 0 | 0 | 0 |
| 19.04.2021 07:00 - 08:00 | 0 | 0 | 0 | 0 |
| 19.04.2021 08:00 - 09:00 | 0 | 0 | 0 | 0 |
| 19.04.2021 09:00 - 10:00 | 0 | 0 | 0 | 0 |
| 19.04.2021 10:00 - 11:00 | 0 | 0 | 0 | 0 |
| 19.04.2021 11:00 - 12:00 | 0 | 0 | 0 | 0 |
| 19.04.2021 12:00 - 13:00 | 0 | 0 | 0 | 0 |
| 19.04.2021 13:00 - 14:00 | 0 | 0 | 0 | 0 |
| 19.04.2021 14:00 - 15:00 | 0 | 0 | 0 | 0 |
| 19.04.2021 15:00 - 16:00 | 0 | 0 | 0 | 0 |
| 19.04.2021 16:00 - 17:00 | 0 | 0 | 0 | 0 |
| 19.04.2021 17:00 - 18:00 | 0 | 0 | 0 | 0 |
| 19.04.2021 18:00 - 19:00 | 0 | 0 | 0 | 0 |
| 19.04.2021 19:00 - 20:00 | 0 | 0 | 0 | 0 |
| 19.04.2021 20:00 - 21:00 | 0 | 0 | 0 | 0 |
| 19.04.2021 21:00 - 22:00 | 0 | 0 | 0 | 0 |
| 19.04.2021 22:00 - 23:00 | 0 | 0 | 0 | 0 |
| 19.04.2021 23:00 - 24:00 | 0 | 0 | 0 | 0 |
| 20.04.2021 00:00 - 01:00 | 0 | 0 | 0 | 0 |
| 20.04.2021 01:00 - 02:00 | 0 | 0 | 0 | 0 |
| 20.04.2021 02:00 - 03:00 | 0 | 0 | 0 | 0 |
| 20.04.2021 03:00 - 04:00 | 0 | 0 | 0 | 0 |
| 20.04.2021 04:00 - 05:00 | 0 | 0 | 0 | 0 |
| 20.04.2021 05:00 - 06:00 | 0 | 0 | 0 | 0 |
| 20.04.2021 06:00 - 07:00 | 0 | 0 | 0 | 0 |
| 20.04.2021 07:00 - 08:00 | 0 | 0 | 0 | 0 |
| 20.04.2021 08:00 - 09:00 | 0 | 0 | 0 | 0 |
| 20.04.2021 09:00 - 10:00 | 0 | 0 | 0 | 0 |
| 20.04.2021 10:00 - 11:00 | 0 | 0 | 0 | 0 |
| 20.04.2021 11:00 - 12:00 | 0 | 0 | 0 | 0 |
| 20.04.2021 12:00 - 13:00 | 0 | 0 | 0 | 0 |
| 20.04.2021 13:00 - 14:00 | 0 | 0 | 0 | 0 |
| 20.04.2021 14:00 - 15:00 | 0 | 0 | 0 | 0 |
| 20.04.2021 15:00 - 16:00 | 0 | 0 | 0 | 0 |
| 20.04.2021 16:00 - 17:00 | 0 | 0 | 0 | 0 |
| 20.04.2021 17:00 - 18:00 | 0 | 0 | 0 | 0 |
| 20.04.2021 18:00 - 19:00 | 0 | 0 | 0 | 0 |
| 20.04.2021 19:00 - 20:00 | 0 | 0 | 0 | 0 |
| 20.04.2021 20:00 - 21:00 | 0 | 0 | 0 | 0 |
| 20.04.2021 21:00 - 22:00 | 0 | 0 | 0 | 0 |
| 20.04.2021 22:00 - 23:00 | 0 | 0 | 0 | 0 |
| 20.04.2021 23:00 - 24:00 | 0 | 0 | 0 | 0 |
| 21.04.2021 00:00 - 01:00 | 0 | 0 | 0 | 0 |
| 21.04.2021 01:00 - 02:00 | 0 | 0 | 0 | 0 |
| 21.04.2021 02:00 - 03:00 | 0 | 0 | 0 | 0 |
| 21.04.2021 03:00 - 04:00 | 0 | 0 | 0 | 0 |
| 21.04.2021 04:00 - 05:00 | 0 | 0 | 0 | 0 |
| 21.04.2021 05:00 - 06:00 | 0 | 0 | 0 | 0 |
| 21.04.2021 06:00 - 07:00 | 0 | 0 | 0 | 0 |
| 21.04.2021 07:00 - 08:00 | 0 | 0 | 0 | 0 |
| 21.04.2021 08:00 - 09:00 | 0 | 0 | 0 | 0 |
| 21.04.2021 09:00 - 10:00 | 0 | 0 | 0 | 0 |
| 21.04.2021 10:00 - 11:00 | 0 | 0 | 0 | 0 |
| 21.04.2021 11:00 - 12:00 | 0 | 0 | 0 | 0 |
| 21.04.2021 12:00 - 13:00 | 0 | 0 | 0 | 0 |
| 21.04.2021 13:00 - 14:00 | 0 | 0 | 0 | 0 |
| 21.04.2021 14:00 - 15:00 | 0 | 0 | 0 | 0 |
| 21.04.2021 15:00 - 16:00 | 0 | 0 | 0 | 0 |
| 21.04.2021 16:00 - 17:00 | 0 | 0 | 0 | 0 |
| 21.04.2021 17:00 - 18:00 | 0 | 0 | 0 | 0 |
| 21.04.2021 18:00 - 19:00 | 0 | 0 | 0 | 0 |
| 21.04.2021 19:00 - 20:00 | 0 | 0 | 0 | 0 |
| 21.04.2021 20:00 - 21:00 | 0 | 0 | 0 | 0 |
| 21.04.2021 21:00 - 22:00 | 0 | 0 | 0 | 0 |
| 21.04.2021 22:00 - 23:00 | 0 | 0 | 0 | 0 |
| 21.04.2021 23:00 - 24:00 | 0 | 0 | 0 | 0 |
| 22.04.2021 00:00 - 01:00 | 0 | 0 | 0 | 0 |
| 22.04.2021 01:00 - 02:00 | 0 | 0 | 0 | 0 |
| 22.04.2021 02:00 - 03:00 | 0 | 0 | 0 | 0 |
| 22.04.2021 03:00 - 04:00 | 0 | 0 | 0 | 0 |
| 22.04.2021 04:00 - 05:00 | 0 | 0 | 0 | 0 |
| 22.04.2021 05:00 - 06:00 | 0 | 0 | 0 | 0 |
| 22.04.2021 06:00 - 07:00 | 0 | 0 | 0 | 0 |
| 22.04.2021 07:00 - 08:00 | 0 | 0 | 0 | 0 |
| 22.04.2021 08:00 - 09:00 | 0 | 0 | 0 | 0 |
| 22.04.2021 09:00 - 10:00 | 0 | 0 | 0 | 0 |
| 22.04.2021 10:00 - 11:00 | 0 | 0 | 0 | 0 |
| 22.04.2021 11:00 - 12:00 | 0 | 0 | 0 | 0 |
| 22.04.2021 12:00 - 13:00 | 0 | 0 | 0 | 0 |
| 22.04.2021 13:00 - 14:00 | 0 | 0 | 0 | 0 |
| 22.04.2021 14:00 - 15:00 | 0 | 0 | 0 | 0 |
| 22.04.2021 15:00 - 16:00 | 0 | 0 | 0 | 0 |
| 22.04.2021 16:00 - 17:00 | 0 | 0 | 0 | 0 |
| 22.04.2021 17:00 - 18:00 | 0 | 0 | 0 | 0 |
| 22.04.2021 18:00 - 19:00 | 0 | 0 | 0 | 0 |
| 22.04.2021 19:00 - 20:00 | 0 | 0 | 0 | 0 |
| 22.04.2021 20:00 - 21:00 | 0 | 0 | 0 | 0 |
| 22.04.2021 21:00 - 22:00 | 0 | 0 | 0 | 0 |
| 22.04.2021 22:00 - 23:00 | 0 | 0 | 0 | 0 |
| 22.04.2021 23:00 - 24:00 | 0 | 0 | 0 | 0 |
| 23.04.2021 00:00 - 01:00 | 0 | 0 | 0 | 0 |
| 23.04.2021 01:00 - 02:00 | 0 | 0 | 0 | 0 |
| 23.04.2021 02:00 - 03:00 | 0 | 0 | 0 | 0 |
| 23.04.2021 03:00 - 04:00 | 0 | 0 | 0 | 0 |
| 23.04.2021 04:00 - 05:00 | 0 | 0 | 0 | 0 |
| 23.04.2021 05:00 - 06:00 | 0 | 0 | 0 | 0 |
| 23.04.2021 06:00 - 07:00 | 0 | 0 | 0 | 0 |
| 23.04.2021 07:00 - 08:00 | 0 | 0 | 0 | 0 |
| 23.04.2021 08:00 - 09:00 | 0 | 0 | 0 | 0 |
| 23.04.2021 09:00 - 10:00 | 0 | 0 | 0 | 0 |
| 23.04.2021 10:00 - 11:00 | 0 | 0 | 0 | 0 |
| 23.04.2021 11:00 - 12:00 | 0 | 0 | 0 | 0 |
| 23.04.2021 12:00 - 13:00 | 0 | 0 | 0 | 0 |
| 23.04.2021 13:00 - 14:00 | 0 | 0 | 0 | 0 |
| 23.04.2021 14:00 - 15:00 | 0 | 0 | 0 | 0 |
| 23.04.2021 15:00 - 16:00 | 0 | 0 | 0 | 0 |
| 23.04.2021 16:00 - 17:00 | 0 | 0 | 0 | 0 |
| 23.04.2021 17:00 - 18:00 | 0 | 0 | 0 | 0 |
| 23.04.2021 18:00 - 19:00 | 0 | 0 | 0 | 0 |
| 23.04.2021 19:00 - 20:00 | 0 | 0 | 0 | 0 |
| 23.04.2021 20:00 - 21:00 | 0 | 0 | 0 | 0 |
| 23.04.2021 21:00 - 22:00 | 0 | 0 | 0 | 0 |
| 23.04.2021 22:00 - 23:00 | 0 | 0 | 0 | 0 |
| 23.04.2021 23:00 - 24:00 | 0 | 0 | 0 | 0 |
| 24.04.2021 00:00 - 01:00 | 0 | 0 | 0 | 0 |
| 24.04.2021 01:00 - 02:00 | 0 | 0 | 0 | 0 |
| 24.04.2021 02:00 - 03:00 | 0 | 0 | 0 | 0 |
| 24.04.2021 03:00 - 04:00 | 0 | 0 | 0 | 0 |
| 24.04.2021 04:00 - 05:00 | 0 | 0 | 0 | 0 |
| 24.04.2021 05:00 - 06:00 | 0 | 0 | 0 | 0 |
| 24.04.2021 06:00 - 07:00 | 0 | 0 | 0 | 0 |
| 24.04.2021 07:00 - 08:00 | 0 | 0 | 0 | 0 |
| 24.04.2021 08:00 - 09:00 | 0 | 0 | 0 | 0 |
| 24.04.2021 09:00 - 10:00 | 0 | 0 | 0 | 0 |
| 24.04.2021 10:00 - 11:00 | 0 | 0 | 0 | 0 |
| 24.04.2021 11:00 - 12:00 | 0 | 0 | 0 | 0 |
| 24.04.2021 12:00 - 13:00 | 0 | 0 | 0 | 0 |
| 24.04.2021 13:00 - 14:00 | 0 | 0 | 0 | 0 |
| 24.04.2021 14:00 - 15:00 | 0 | 0 | 0 | 0 |
| 24.04.2021 15:00 - 16:00 | 0 | 0 | 0 | 0 |
| 24.04.2021 16:00 - 17:00 | 0 | 0 | 0 | 0 |
| 24.04.2021 17:00 - 18:00 | 0 | 0 | 0 | 0 |
| 24.04.2021 18:00 - 19:00 | 0 | 0 | 0 | 0 |
| 24.04.2021 19:00 - 20:00 | 0 | 0 | 0 | 0 |
| 24.04.2021 20:00 - 21:00 | 0 | 0 | 0 | 0 |
| 24.04.2021 21:00 - 22:00 | 0 | 0 | 0 | 0 |
| 24.04.2021 22:00 - 23:00 | 0 | 0 | 0 | 0 |
| 24.04.2021 23:00 - 24:00 | 0 | 0 | 0 | 0 |
| 25.04.2021 00:00 - 01:00 | 0 | 0 | 0 | 0 |
| 25.04.2021 01:00 - 02:00 | 0 | 0 | 0 | 0 |
| 25.04.2021 02:00 - 03:00 | 0 | 0 | 0 | 0 |
| 25.04.2021 03:00 - 04:00 | 0 | 0 | 0 | 0 |
| 25.04.2021 04:00 - 05:00 | 0 | 0 | 0 | 0 |
| 25.04.2021 05:00 - 06:00 | 0 | 0 | 0 | 0 |
| 25.04.2021 06:00 - 07:00 | 0 | 0 | 0 | 0 |
| 25.04.2021 07:00 - 08:00 | 0 | 0 | 0 | 0 |
| 25.04.2021 08:00 - 09:00 | 0 | 0 | 0 | 0 |
| 25.04.2021 09:00 - 10:00 | 0 | 0 | 0 | 0 |
| 25.04.2021 10:00 - 11:00 | 0 | 0 | 0 | 0 |
| 25.04.2021 11:00 - 12:00 | 0 | 0 | 0 | 0 |
| 25.04.2021 12:00 - 13:00 | 0 | 0 | 0 | 0 |
| 25.04.2021 13:00 - 14:00 | 0 | 0 | 0 | 0 |
| 25.04.2021 14:00 - 15:00 | 0 | 0 | 0 | 0 |
| 25.04.2021 15:00 - 16:00 | 0 | 0 | 0 | 0 |
| 25.04.2021 16:00 - 17:00 | 0 | 0 | 0 | 0 |
| 25.04.2021 17:00 - 18:00 | 0 | 0 | 0 | 0 |
| 25.04.2021 18:00 - 19:00 | 0 | 0 | 0 | 0 |
| 25.04.2021 19:00 - 20:00 | 0 | 0 | 0 | 0 |
| 25.04.2021 20:00 - 21:00 | 0 | 0 | 0 | 0 |
| 25.04.2021 21:00 - 22:00 | 0 | 0 | 0 | 0 |
| 25.04.2021 22:00 - 23:00 | 0 | -700 | 0 | 0 |
| 25.04.2021 23:00 - 24:00 | 0 | -700 | 0 | 0 |
| 26.04.2021 00:00 - 01:00 | 0 | -700 | 0 | 0 |
| 26.04.2021 01:00 - 02:00 | 0 | -700 | 0 | 0 |
| 26.04.2021 02:00 - 03:00 | 0 | -700 | 0 | 0 |
| 26.04.2021 03:00 - 04:00 | 0 | -700 | 0 | 0 |
| 26.04.2021 04:00 - 05:00 | 0 | -700 | 0 | 0 |
| 26.04.2021 05:00 - 06:00 | 0 | -700 | 0 | 0 |
| 26.04.2021 06:00 - 07:00 | 0 | 0 | 0 | 0 |
| 26.04.2021 07:00 - 08:00 | 0 | 0 | 0 | 0 |
| 26.04.2021 08:00 - 09:00 | 0 | 0 | 0 | 0 |
| 26.04.2021 09:00 - 10:00 | 0 | 0 | 0 | 0 |
| 26.04.2021 10:00 - 11:00 | 0 | 0 | 0 | 0 |
| 26.04.2021 11:00 - 12:00 | 0 | 0 | 0 | 0 |
| 26.04.2021 12:00 - 13:00 | 0 | 0 | 0 | 0 |
| 26.04.2021 13:00 - 14:00 | 0 | 0 | 0 | 0 |
| 26.04.2021 14:00 - 15:00 | 0 | 0 | 0 | 0 |
| 26.04.2021 15:00 - 16:00 | 0 | 0 | 0 | 0 |
| 26.04.2021 16:00 - 17:00 | 0 | 0 | 0 | 0 |
| 26.04.2021 17:00 - 18:00 | 0 | 0 | 0 | 0 |
| 26.04.2021 18:00 - 19:00 | 0 | 0 | 0 | 0 |
| 26.04.2021 19:00 - 20:00 | 0 | 0 | 0 | 0 |
| 26.04.2021 20:00 - 21:00 | 0 | 0 | 0 | 0 |
| 26.04.2021 21:00 - 22:00 | 0 | 0 | 0 | 0 |
| 26.04.2021 22:00 - 23:00 | 0 | 0 | 0 | 0 |
| 26.04.2021 23:00 - 24:00 | 0 | 0 | 0 | 0 |
| 27.04.2021 00:00 - 01:00 | 0 | 0 | 0 | 0 |
| 27.04.2021 01:00 - 02:00 | 0 | 0 | 0 | 0 |
| 27.04.2021 02:00 - 03:00 | 0 | 0 | 0 | 0 |
| 27.04.2021 03:00 - 04:00 | 0 | 0 | 0 | 0 |
| 27.04.2021 04:00 - 05:00 | 0 | 0 | 0 | 0 |
| 27.04.2021 05:00 - 06:00 | 0 | 0 | 0 | 0 |
| 27.04.2021 06:00 - 07:00 | 0 | 0 | 0 | 0 |
| 27.04.2021 07:00 - 08:00 | 0 | 0 | 0 | 0 |
| 27.04.2021 08:00 - 09:00 | 0 | 0 | 0 | 0 |
| 27.04.2021 09:00 - 10:00 | 0 | 0 | 0 | 0 |
| 27.04.2021 10:00 - 11:00 | 0 | 0 | 0 | 0 |
| 27.04.2021 11:00 - 12:00 | 0 | 0 | 0 | 0 |
| 27.04.2021 12:00 - 13:00 | 0 | 0 | 0 | 0 |
| 27.04.2021 13:00 - 14:00 | 0 | 0 | 0 | 0 |
| 27.04.2021 14:00 - 15:00 | 0 | 0 | 0 | 0 |
| 27.04.2021 15:00 - 16:00 | 0 | 0 | 0 | 0 |
| 27.04.2021 16:00 - 17:00 | 0 | 0 | 0 | 0 |
| 27.04.2021 17:00 - 18:00 | 0 | 0 | 0 | 0 |
| 27.04.2021 18:00 - 19:00 | 0 | 0 | 0 | 0 |
| 27.04.2021 19:00 - 20:00 | 0 | 0 | 0 | 0 |
| 27.04.2021 20:00 - 21:00 | 0 | 0 | 0 | 0 |
| 27.04.2021 21:00 - 22:00 | 0 | 0 | 0 | 0 |
| 27.04.2021 22:00 - 23:00 | 0 | 0 | 0 | 0 |
| 27.04.2021 23:00 - 24:00 | 0 | 0 | 0 | 0 |
| 28.04.2021 00:00 - 01:00 | 0 | 0 | 0 | 0 |
| 28.04.2021 01:00 - 02:00 | 0 | 0 | 0 | 0 |
| 28.04.2021 02:00 - 03:00 | 0 | 0 | 0 | 0 |
| 28.04.2021 03:00 - 04:00 | 0 | 0 | 0 | 0 |
| 28.04.2021 04:00 - 05:00 | 0 | 0 | 0 | 0 |
| 28.04.2021 05:00 - 06:00 | 0 | 0 | 0 | 0 |
| 28.04.2021 06:00 - 07:00 | 0 | 0 | 0 | 0 |
| 28.04.2021 07:00 - 08:00 | 0 | 0 | 0 | 0 |
| 28.04.2021 08:00 - 09:00 | 0 | 0 | 0 | 0 |
| 28.04.2021 09:00 - 10:00 | 0 | 0 | 0 | 0 |
| 28.04.2021 10:00 - 11:00 | 0 | 0 | 0 | 0 |
| 28.04.2021 11:00 - 12:00 | 0 | 0 | 0 | 0 |
| 28.04.2021 12:00 - 13:00 | 0 | 0 | 0 | 0 |
| 28.04.2021 13:00 - 14:00 | 0 | 0 | 0 | 0 |
| 28.04.2021 14:00 - 15:00 | 0 | 0 | 0 | 0 |
| 28.04.2021 15:00 - 16:00 | 0 | 0 | 0 | 0 |
| 28.04.2021 16:00 - 17:00 | 0 | 0 | 0 | 0 |
| 28.04.2021 17:00 - 18:00 | 0 | 0 | 0 | 0 |
| 28.04.2021 18:00 - 19:00 | 0 | 0 | 0 | 0 |
| 28.04.2021 19:00 - 20:00 | 0 | 0 | 0 | 0 |
| 28.04.2021 20:00 - 21:00 | 0 | 0 | 0 | 0 |
| 28.04.2021 21:00 - 22:00 | 0 | 0 | 0 | 0 |
| 28.04.2021 22:00 - 23:00 | 0 | 0 | 0 | 0 |
| 28.04.2021 23:00 - 24:00 | 0 | 0 | 0 | 0 |
| 29.04.2021 00:00 - 01:00 | 0 | 0 | 0 | 0 |
| 29.04.2021 01:00 - 02:00 | 0 | 0 | 0 | 0 |
| 29.04.2021 02:00 - 03:00 | 0 | 0 | 0 | 0 |
| 29.04.2021 03:00 - 04:00 | 0 | 0 | 0 | 0 |
| 29.04.2021 04:00 - 05:00 | 0 | 0 | 0 | 0 |
| 29.04.2021 05:00 - 06:00 | 0 | 0 | 0 | 0 |
| 29.04.2021 06:00 - 07:00 | 0 | 0 | 0 | 0 |
| 29.04.2021 07:00 - 08:00 | 0 | 0 | 0 | 0 |
| 29.04.2021 08:00 - 09:00 | 0 | 0 | 0 | 0 |
| 29.04.2021 09:00 - 10:00 | 0 | 0 | 0 | 0 |
| 29.04.2021 10:00 - 11:00 | 0 | 0 | 0 | 0 |
| 29.04.2021 11:00 - 12:00 | 0 | 0 | 0 | 0 |
| 29.04.2021 12:00 - 13:00 | 0 | 0 | 0 | 0 |
| 29.04.2021 13:00 - 14:00 | 0 | 0 | 0 | 0 |
| 29.04.2021 14:00 - 15:00 | 0 | 0 | 0 | 0 |
| 29.04.2021 15:00 - 16:00 | 0 | 0 | 0 | 0 |
| 29.04.2021 16:00 - 17:00 | 0 | 0 | 0 | 0 |
| 29.04.2021 17:00 - 18:00 | 0 | 0 | 0 | 0 |
| 29.04.2021 18:00 - 19:00 | 0 | 0 | 0 | 0 |
| 29.04.2021 19:00 - 20:00 | 0 | 0 | 0 | 0 |
| 29.04.2021 20:00 - 21:00 | 0 | 0 | 0 | 0 |
| 29.04.2021 21:00 - 22:00 | 0 | 0 | 0 | 0 |
| 29.04.2021 22:00 - 23:00 | 0 | 0 | 0 | 0 |
| 29.04.2021 23:00 - 24:00 | 0 | 0 | 0 | 0 |
| 30.04.2021 00:00 - 01:00 | 0 | 0 | 0 | 0 |
| 30.04.2021 01:00 - 02:00 | 0 | 0 | 0 | 0 |
| 30.04.2021 02:00 - 03:00 | 0 | 0 | 0 | 0 |
| 30.04.2021 03:00 - 04:00 | 0 | 0 | 0 | 0 |
| 30.04.2021 04:00 - 05:00 | 0 | 0 | 0 | 0 |
| 30.04.2021 05:00 - 06:00 | 0 | 0 | 0 | 0 |
| 30.04.2021 06:00 - 07:00 | 0 | 0 | 0 | 0 |
| 30.04.2021 07:00 - 08:00 | 0 | 0 | 0 | 0 |
| 30.04.2021 08:00 - 09:00 | 0 | 0 | 0 | 0 |
| 30.04.2021 09:00 - 10:00 | 0 | 0 | 0 | 0 |
| 30.04.2021 10:00 - 11:00 | 0 | 0 | 0 | 0 |
| 30.04.2021 11:00 - 12:00 | 0 | 0 | 0 | 0 |
| 30.04.2021 12:00 - 13:00 | 0 | 0 | 0 | 0 |
| 30.04.2021 13:00 - 14:00 | 0 | 0 | 0 | 0 |
| 30.04.2021 14:00 - 15:00 | 0 | 0 | 0 | 0 |
| 30.04.2021 15:00 - 16:00 | 0 | 0 | 0 | 0 |
| 30.04.2021 16:00 - 17:00 | 0 | 0 | 0 | 0 |
| 30.04.2021 17:00 - 18:00 | 0 | 0 | 0 | 0 |
| 30.04.2021 18:00 - 19:00 | 0 | 0 | 0 | 0 |
| 30.04.2021 19:00 - 20:00 | 0 | 0 | 0 | 0 |
| 30.04.2021 20:00 - 21:00 | 0 | 0 | 0 | 0 |
| 30.04.2021 21:00 - 22:00 | 0 | 0 | 0 | 0 |
| 30.04.2021 22:00 - 23:00 | 0 | 0 | 0 | 0 |
| 30.04.2021 23:00 - 24:00 | 0 | 0 | 0 | 0 |
| 01.05.2021 00:00 - 01:00 | 0 | 0 | 0 | 0 |
| 01.05.2021 01:00 - 02:00 | 0 | 0 | 0 | 0 |
| 01.05.2021 02:00 - 03:00 | 0 | 0 | 0 | 0 |
| 01.05.2021 03:00 - 04:00 | 0 | 0 | 0 | 0 |
| 01.05.2021 04:00 - 05:00 | 0 | 0 | 0 | 0 |
| 01.05.2021 05:00 - 06:00 | 0 | 0 | 0 | 0 |